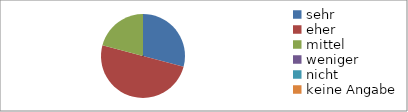
| Category | Series 0 |
|---|---|
| sehr | 7 |
| eher | 12 |
| mittel | 5 |
| weniger | 0 |
| nicht | 0 |
| keine Angabe | 0 |